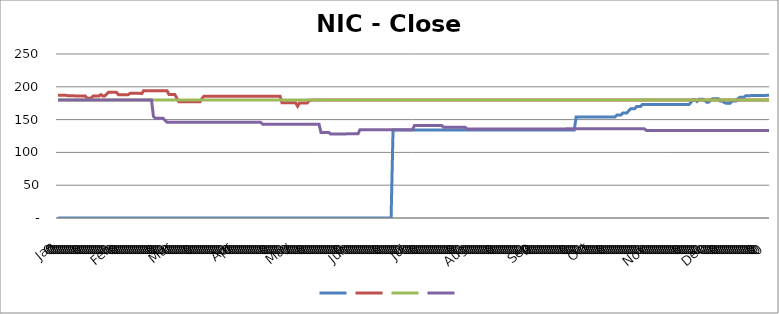
| Category | #REF! |
|---|---|
| Jan | 180 |
| 0 | 180 |
| 0 | 180 |
| 0 | 180 |
| 0 | 180 |
| 0 | 180 |
| 0 | 180 |
| 0 | 180 |
| 0 | 180 |
| 0 | 180 |
| 0 | 180 |
| 0 | 180 |
| 0 | 180 |
| 0 | 180 |
| 0 | 180 |
| 0 | 180 |
| 0 | 180 |
| 0 | 180 |
| 0 | 180 |
| 0 | 180 |
| 0 | 180 |
| 0 | 180 |
| 0 | 180 |
| 0 | 180 |
| 0 | 180 |
| 0 | 180 |
| 0 | 180 |
| 0 | 180 |
| 0 | 180 |
| 0 | 180 |
| 0 | 180 |
| Feb | 180 |
| 0 | 180 |
| 0 | 180 |
| 0 | 180 |
| 0 | 180 |
| 0 | 180 |
| 0 | 180 |
| 0 | 180 |
| 0 | 180 |
| 0 | 180 |
| 0 | 180 |
| 0 | 180 |
| 0 | 180 |
| 0 | 180 |
| 0 | 180 |
| 0 | 180 |
| 0 | 180 |
| 0 | 180 |
| 0 | 155 |
| 0 | 151.9 |
| 0 | 151.9 |
| 0 | 151.9 |
| 0 | 151.9 |
| 0 | 151.9 |
| 0 | 148.9 |
| 0 | 146 |
| 0 | 146 |
| 0 | 146 |
| 0 | 146 |
| Mar | 146 |
| 0 | 146 |
| 0 | 146 |
| 0 | 146 |
| 0 | 146 |
| 0 | 146 |
| 0 | 146 |
| 0 | 146 |
| 0 | 146 |
| 0 | 146 |
| 0 | 146 |
| 0 | 146 |
| 0 | 146 |
| 0 | 146 |
| 0 | 146 |
| 0 | 146 |
| 0 | 146 |
| 0 | 146 |
| 0 | 146 |
| 0 | 146 |
| 0 | 146 |
| 0 | 146 |
| 0 | 146 |
| 0 | 146 |
| 0 | 146 |
| 0 | 146 |
| 0 | 146 |
| 0 | 146 |
| 0 | 146 |
| 0 | 146 |
| 0 | 146 |
| Apr | 146 |
| 0 | 146 |
| 0 | 146 |
| 0 | 146 |
| 0 | 146 |
| 0 | 146 |
| 0 | 146 |
| 0 | 146 |
| 0 | 146 |
| 0 | 146 |
| 0 | 146 |
| 0 | 146 |
| 0 | 146 |
| 0 | 146 |
| 0 | 143.1 |
| 0 | 143.1 |
| 0 | 143.1 |
| 0 | 143.1 |
| 0 | 143.1 |
| 0 | 143.1 |
| 0 | 143.1 |
| 0 | 143.1 |
| 0 | 143.1 |
| 0 | 143.1 |
| 0 | 143.1 |
| 0 | 143.1 |
| 0 | 143.1 |
| 0 | 143.1 |
| 0 | 143.1 |
| 0 | 143.1 |
| May | 143.1 |
| 0 | 143.1 |
| 0 | 143.1 |
| 0 | 143.1 |
| 0 | 143.1 |
| 0 | 143.1 |
| 0 | 143.1 |
| 0 | 143.1 |
| 0 | 143.1 |
| 0 | 143.1 |
| 0 | 143.1 |
| 0 | 143.1 |
| 0 | 143.1 |
| 0 | 143.1 |
| 0 | 130.5 |
| 0 | 130.5 |
| 0 | 130.5 |
| 0 | 130.5 |
| 0 | 130.5 |
| 0 | 127.9 |
| 0 | 127.9 |
| 0 | 127.9 |
| 0 | 127.9 |
| 0 | 127.9 |
| 0 | 127.9 |
| 0 | 127.9 |
| 0 | 127.9 |
| 0 | 128.258 |
| 0 | 128.258 |
| 0 | 128.258 |
| 0 | 128.258 |
| Jun | 128.258 |
| 0 | 128.258 |
| 0 | 128.258 |
| 0 | 134.432 |
| 0 | 134.432 |
| 0 | 134.432 |
| 0 | 134.432 |
| 0 | 134.432 |
| 0 | 134.432 |
| 0 | 134.432 |
| 0 | 134.432 |
| 0 | 134.432 |
| 0 | 134.432 |
| 0 | 134.432 |
| 0 | 134.432 |
| 0 | 134.432 |
| 0 | 134.432 |
| 0 | 134.432 |
| 0 | 134.432 |
| 0 | 134.432 |
| 0 | 134.432 |
| 0 | 134.432 |
| 0 | 134.432 |
| 0 | 134.432 |
| 0 | 134.432 |
| 0 | 134.432 |
| 0 | 134.432 |
| 0 | 134.432 |
| 0 | 134.432 |
| 0 | 134.432 |
| Jul | 134.432 |
| 0 | 141.1 |
| 0 | 141.1 |
| 0 | 141.1 |
| 0 | 141.1 |
| 0 | 141.1 |
| 0 | 141.1 |
| 0 | 141.1 |
| 0 | 141.1 |
| 0 | 141.1 |
| 0 | 141.1 |
| 0 | 141.1 |
| 0 | 141.1 |
| 0 | 141.1 |
| 0 | 141.1 |
| 0 | 141.1 |
| 0 | 138.3 |
| 0 | 138.3 |
| 0 | 138.3 |
| 0 | 138.3 |
| 0 | 138.3 |
| 0 | 138.3 |
| 0 | 138.3 |
| 0 | 138.3 |
| 0 | 138.3 |
| 0 | 138.3 |
| 0 | 138.3 |
| 0 | 138.3 |
| 0 | 135.75 |
| 0 | 135.75 |
| 0 | 135.75 |
| Aug | 135.75 |
| 0 | 135.75 |
| 0 | 135.75 |
| 0 | 135.75 |
| 0 | 135.75 |
| 0 | 135.75 |
| 0 | 135.75 |
| 0 | 135.75 |
| 0 | 135.75 |
| 0 | 135.75 |
| 0 | 135.75 |
| 0 | 135.75 |
| 0 | 135.75 |
| 0 | 135.75 |
| 0 | 135.75 |
| 0 | 135.75 |
| 0 | 135.75 |
| 0 | 135.75 |
| 0 | 135.75 |
| 0 | 135.75 |
| 0 | 135.75 |
| 0 | 135.75 |
| 0 | 135.75 |
| 0 | 135.75 |
| 0 | 135.75 |
| 0 | 135.75 |
| 0 | 135.75 |
| 0 | 135.75 |
| 0 | 135.75 |
| 0 | 135.75 |
| 0 | 135.75 |
| Sep | 135.75 |
| 0 | 135.75 |
| 0 | 135.75 |
| 0 | 135.75 |
| 0 | 135.75 |
| 0 | 135.75 |
| 0 | 135.75 |
| 0 | 135.75 |
| 0 | 135.75 |
| 0 | 135.75 |
| 0 | 135.75 |
| 0 | 135.75 |
| 0 | 135.75 |
| 0 | 135.75 |
| 0 | 135.75 |
| 0 | 135.75 |
| 0 | 135.75 |
| 0 | 136 |
| 0 | 136 |
| 0 | 136 |
| 0 | 136 |
| 0 | 136 |
| 0 | 136 |
| 0 | 136 |
| 0 | 136 |
| 0 | 136 |
| 0 | 136 |
| 0 | 136 |
| 0 | 136 |
| 0 | 136 |
| Oct | 136 |
| 0 | 136 |
| 0 | 136 |
| 0 | 136 |
| 0 | 136 |
| 0 | 136 |
| 0 | 136 |
| 0 | 136 |
| 0 | 136 |
| 0 | 136 |
| 0 | 136 |
| 0 | 136 |
| 0 | 136 |
| 0 | 136 |
| 0 | 136 |
| 0 | 136 |
| 0 | 136 |
| 0 | 136 |
| 0 | 136 |
| 0 | 136 |
| 0 | 136 |
| 0 | 136 |
| 0 | 136 |
| 0 | 136 |
| 0 | 136 |
| 0 | 136 |
| 0 | 136 |
| 0 | 136 |
| 0 | 133.5 |
| 0 | 133.5 |
| 0 | 133.5 |
| Nov | 133.5 |
| 0 | 133.5 |
| 0 | 133.5 |
| 0 | 133.5 |
| 0 | 133.5 |
| 0 | 133.5 |
| 0 | 133.5 |
| 0 | 133.5 |
| 0 | 133.5 |
| 0 | 133.5 |
| 0 | 133.5 |
| 0 | 133.5 |
| 0 | 133.5 |
| 0 | 133.5 |
| 0 | 133.5 |
| 0 | 133.5 |
| 0 | 133.5 |
| 0 | 133.5 |
| 0 | 133.5 |
| 0 | 133.5 |
| 0 | 133.5 |
| 0 | 133.5 |
| 0 | 133.5 |
| 0 | 133.5 |
| 0 | 133.5 |
| 0 | 133.5 |
| 0 | 133.5 |
| 0 | 133.5 |
| 0 | 133.5 |
| 0 | 133.5 |
| Dec | 133.5 |
| 0 | 133.5 |
| 0 | 133.5 |
| 0 | 133.5 |
| 0 | 133.5 |
| 0 | 133.5 |
| 0 | 133.5 |
| 0 | 133.5 |
| 0 | 133.5 |
| 0 | 133.5 |
| 0 | 133.5 |
| 0 | 133.5 |
| 0 | 133.5 |
| 0 | 133.5 |
| 0 | 133.5 |
| 0 | 133.5 |
| 0 | 133.5 |
| 0 | 133.5 |
| 0 | 133.5 |
| 0 | 133.5 |
| 0 | 133.5 |
| 0 | 133.5 |
| 0 | 133.5 |
| 0 | 133.5 |
| 0 | 133.5 |
| 0 | 133.5 |
| 0 | 133.5 |
| 0 | 133.5 |
| 0 | 133.5 |
| 0 | 133.5 |
| 0 | 133.5 |